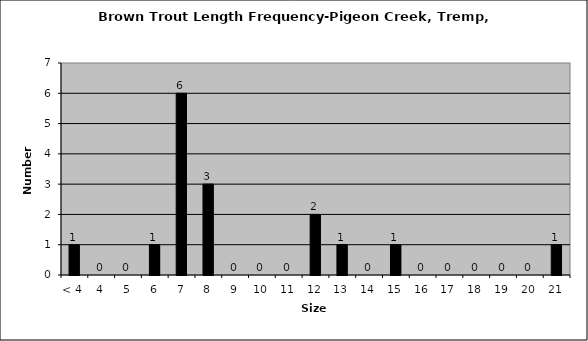
| Category | Series 0 |
|---|---|
| < 4 | 1 |
| 4 | 0 |
| 5 | 0 |
| 6 | 1 |
| 7 | 6 |
| 8 | 3 |
| 9 | 0 |
| 10 | 0 |
| 11 | 0 |
| 12 | 2 |
| 13 | 1 |
| 14 | 0 |
| 15 | 1 |
| 16 | 0 |
| 17 | 0 |
| 18 | 0 |
| 19 | 0 |
| 20 | 0 |
| 21 | 1 |